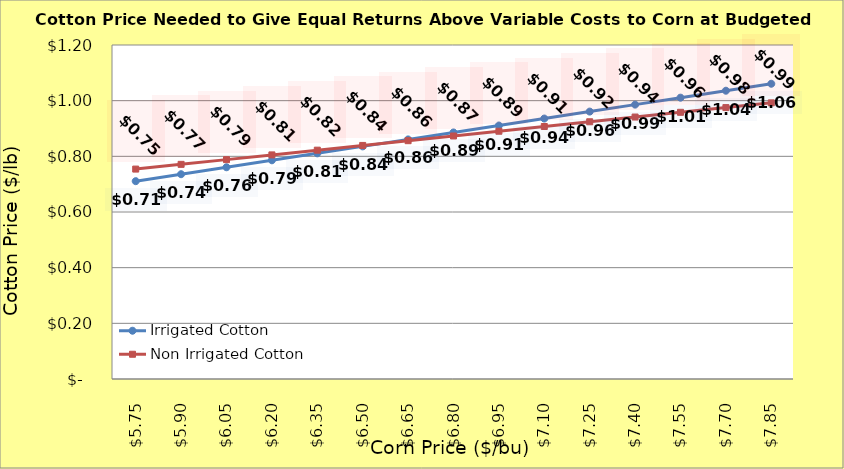
| Category | Irrigated Cotton | Non Irrigated Cotton |
|---|---|---|
| 5.749999999999997 | 0.711 | 0.754 |
| 5.899999999999998 | 0.736 | 0.771 |
| 6.049999999999998 | 0.761 | 0.788 |
| 6.199999999999998 | 0.786 | 0.805 |
| 6.349999999999999 | 0.811 | 0.822 |
| 6.499999999999999 | 0.836 | 0.839 |
| 6.6499999999999995 | 0.861 | 0.856 |
| 6.8 | 0.886 | 0.873 |
| 6.95 | 0.911 | 0.89 |
| 7.1000000000000005 | 0.936 | 0.907 |
| 7.250000000000001 | 0.961 | 0.924 |
| 7.400000000000001 | 0.986 | 0.941 |
| 7.550000000000002 | 1.011 | 0.958 |
| 7.700000000000002 | 1.036 | 0.975 |
| 7.850000000000002 | 1.061 | 0.992 |